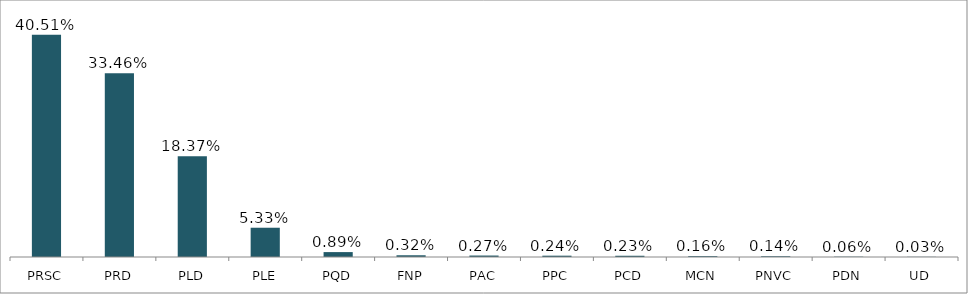
| Category | Votos % |
|---|---|
| PRSC | 0.405 |
| PRD | 0.335 |
| PLD | 0.184 |
| PLE | 0.053 |
| PQD | 0.009 |
| FNP | 0.003 |
| PAC | 0.003 |
| PPC | 0.002 |
| PCD | 0.002 |
| MCN | 0.002 |
| PNVC | 0.001 |
| PDN | 0.001 |
| UD | 0 |